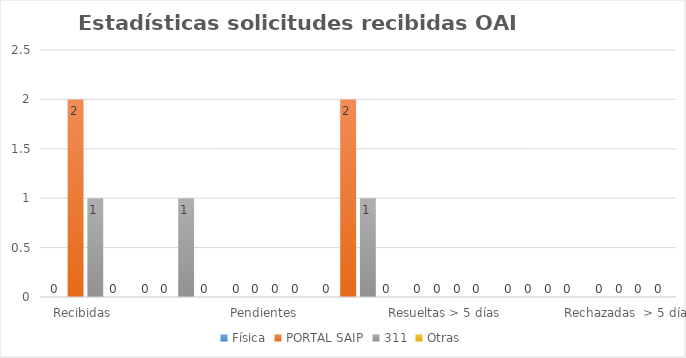
| Category | Física | PORTAL SAIP | 311 | Otras |
|---|---|---|---|---|
| Recibidas  | 0 | 2 | 1 | 0 |
| Cambiadas a otra institución | 0 | 0 | 1 | 0 |
| Pendientes  | 0 | 0 | 0 | 0 |
| Resueltas < 5 días | 0 | 2 | 1 | 0 |
| Resueltas > 5 días  | 0 | 0 | 0 | 0 |
| Rechazadas  < 5 días | 0 | 0 | 0 | 0 |
| Rechazadas  > 5 días | 0 | 0 | 0 | 0 |